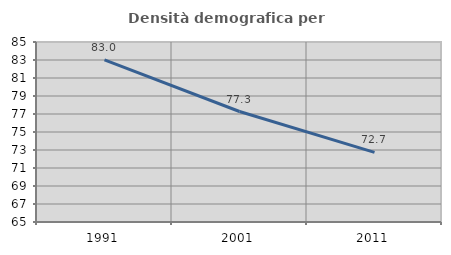
| Category | Densità demografica |
|---|---|
| 1991.0 | 83.017 |
| 2001.0 | 77.275 |
| 2011.0 | 72.73 |